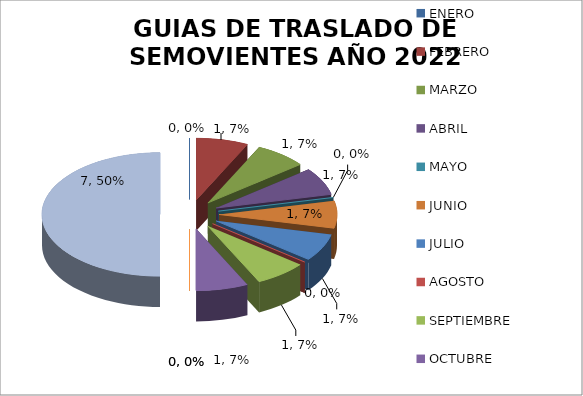
| Category | GUIAS DE TRASLADO DE SEMOVIENTES AÑO 2022 EMITIDAS |
|---|---|
| ENERO | 0 |
| FEBRERO | 1 |
| MARZO | 1 |
| ABRIL | 1 |
| MAYO | 0 |
| JUNIO | 1 |
| JULIO | 1 |
| AGOSTO  | 0 |
| SEPTIEMBRE | 1 |
| OCTUBRE | 1 |
| NOVIEMBRE | 0 |
| DICIEMBRE | 0 |
| TOTAL DE GUIAS DE TRASLADO DE SEMOVIENTES | 7 |